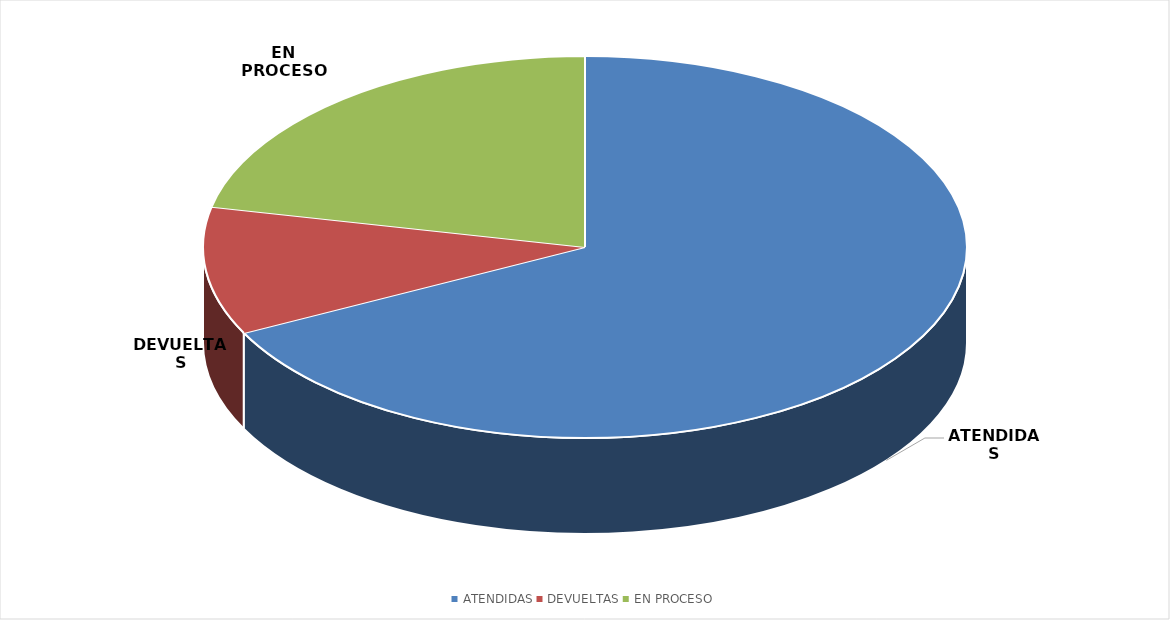
| Category | TOTAL |
|---|---|
| ATENDIDAS | 25 |
| DEVUELTAS | 4 |
| EN PROCESO | 8 |